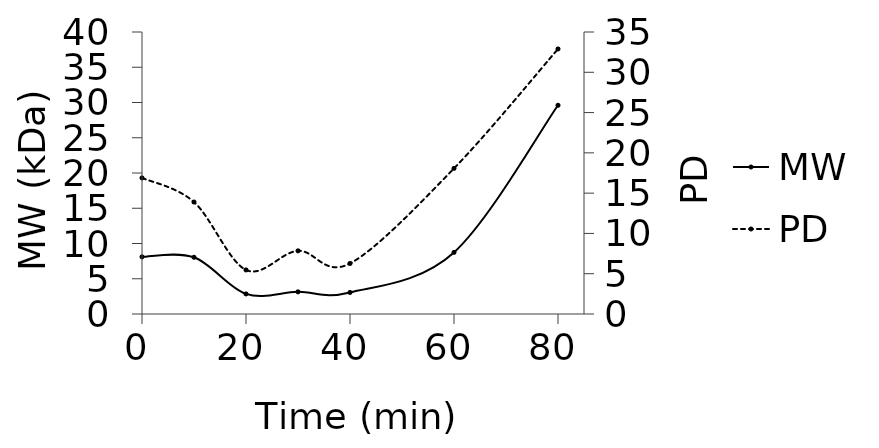
| Category | MW |
|---|---|
| 0.0 | 8.108 |
| 10.0 | 8.045 |
| 20.0 | 2.849 |
| 30.0 | 3.145 |
| 40.0 | 3.053 |
| 60.0 | 8.74 |
| 80.0 | 29.605 |